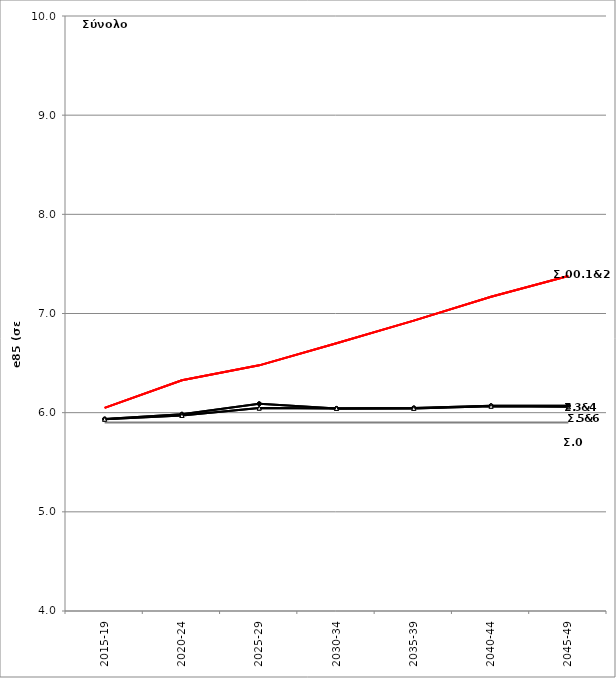
| Category | Σ0.e85 | Σ00.e85 | Σ1.e85 | Σ2.e85 | Σ3.e85 | Σ4.e85 | Σ5.e85 | Σ6.e85 |
|---|---|---|---|---|---|---|---|---|
| 2015-19 | 5.901 | 6.048 | 6.048 | 6.048 | 5.936 | 5.936 | 5.934 | 5.934 |
| 2020-24 | 5.901 | 6.327 | 6.327 | 6.327 | 5.984 | 5.984 | 5.971 | 5.971 |
| 2025-29 | 5.901 | 6.477 | 6.477 | 6.477 | 6.09 | 6.09 | 6.046 | 6.046 |
| 2030-34 | 5.901 | 6.7 | 6.7 | 6.7 | 6.043 | 6.043 | 6.043 | 6.043 |
| 2035-39 | 5.901 | 6.928 | 6.928 | 6.928 | 6.048 | 6.048 | 6.043 | 6.043 |
| 2040-44 | 5.901 | 7.169 | 7.169 | 7.169 | 6.07 | 6.07 | 6.065 | 6.065 |
| 2045-49 | 5.901 | 7.378 | 7.378 | 7.378 | 6.071 | 6.071 | 6.059 | 6.059 |